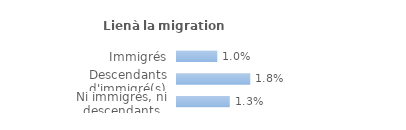
| Category | Series 0 |
|---|---|
| Immigrés | 0.01 |
| Descendants d'immigré(s) | 0.018 |
| Ni immigrés, ni descendants | 0.013 |